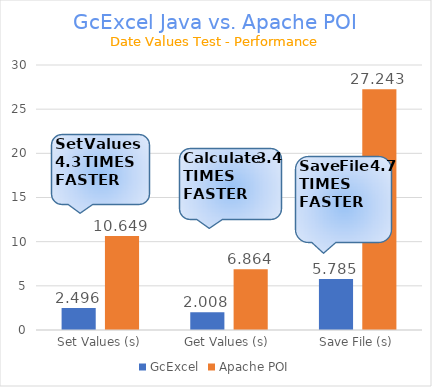
| Category | GcExcel | Apache POI |
|---|---|---|
| Set Values (s) | 2.496 | 10.649 |
| Get Values (s) | 2.008 | 6.864 |
| Save File (s) | 5.785 | 27.243 |